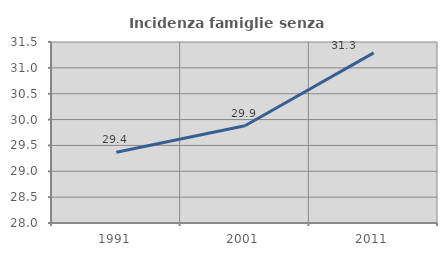
| Category | Incidenza famiglie senza nuclei |
|---|---|
| 1991.0 | 29.367 |
| 2001.0 | 29.88 |
| 2011.0 | 31.29 |